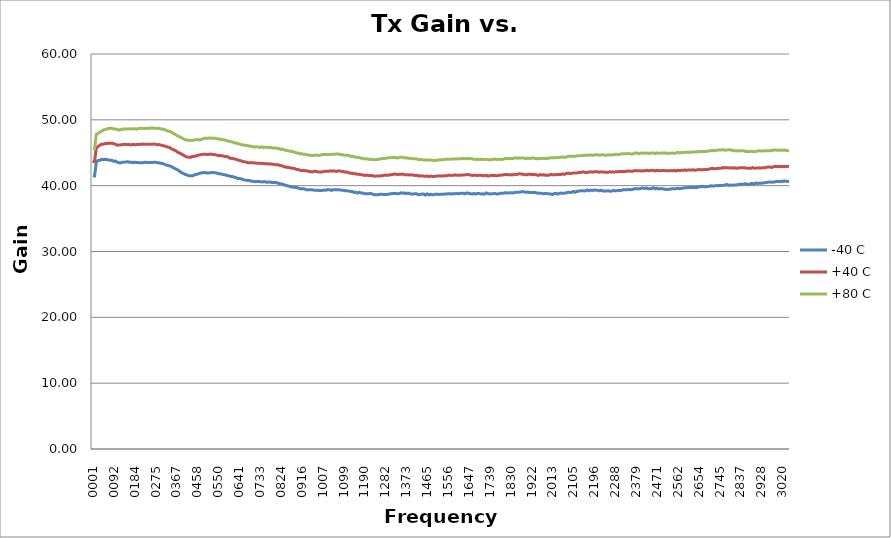
| Category | -40 C | +40 C | +80 C |
|---|---|---|---|
| 1000000.0 | 41.5 | 43.5 | 45.6 |
| 8622500.0 | 41.471 | 43.766 | 45.624 |
| 16245000.0 | 43.64 | 45.762 | 47.831 |
| 23867500.0 | 43.83 | 45.94 | 47.944 |
| 31490000.0 | 43.849 | 46.145 | 48.134 |
| 39112500.0 | 43.963 | 46.312 | 48.281 |
| 46735000.0 | 43.979 | 46.297 | 48.433 |
| 54357500.0 | 43.97 | 46.402 | 48.523 |
| 61980000.0 | 43.991 | 46.395 | 48.594 |
| 69602500.0 | 43.896 | 46.462 | 48.706 |
| 77225000.0 | 43.856 | 46.426 | 48.693 |
| 84847500.0 | 43.843 | 46.466 | 48.718 |
| 92470000.0 | 43.697 | 46.364 | 48.589 |
| 100092500.0 | 43.739 | 46.298 | 48.614 |
| 107715000.0 | 43.565 | 46.153 | 48.523 |
| 115337500.0 | 43.472 | 46.164 | 48.444 |
| 122960000.0 | 43.462 | 46.197 | 48.558 |
| 130582500.0 | 43.574 | 46.237 | 48.528 |
| 138205000.0 | 43.575 | 46.28 | 48.633 |
| 145827500.0 | 43.583 | 46.267 | 48.602 |
| 153450000.0 | 43.626 | 46.243 | 48.606 |
| 161072500.0 | 43.569 | 46.236 | 48.64 |
| 168695000.0 | 43.57 | 46.18 | 48.613 |
| 176317500.0 | 43.497 | 46.273 | 48.64 |
| 183940000.0 | 43.576 | 46.2 | 48.644 |
| 191562500.0 | 43.511 | 46.27 | 48.581 |
| 199185000.0 | 43.501 | 46.245 | 48.676 |
| 206807500.0 | 43.494 | 46.288 | 48.689 |
| 214430000.0 | 43.501 | 46.257 | 48.731 |
| 222052500.0 | 43.482 | 46.337 | 48.695 |
| 229675000.0 | 43.562 | 46.28 | 48.687 |
| 237297500.0 | 43.526 | 46.294 | 48.728 |
| 244920000.0 | 43.492 | 46.285 | 48.654 |
| 252542500.0 | 43.545 | 46.284 | 48.779 |
| 260165000.0 | 43.504 | 46.285 | 48.709 |
| 267787500.0 | 43.555 | 46.321 | 48.765 |
| 275410000.0 | 43.549 | 46.296 | 48.688 |
| 283032500.0 | 43.471 | 46.212 | 48.666 |
| 290655000.0 | 43.47 | 46.248 | 48.734 |
| 298277500.0 | 43.406 | 46.165 | 48.64 |
| 305900000.0 | 43.364 | 46.096 | 48.584 |
| 313522500.0 | 43.273 | 46.036 | 48.521 |
| 321145000.0 | 43.145 | 45.967 | 48.428 |
| 328767500.0 | 43.081 | 45.844 | 48.292 |
| 336390000.0 | 43.006 | 45.809 | 48.259 |
| 344012500.0 | 42.924 | 45.603 | 48.128 |
| 351635000.0 | 42.74 | 45.505 | 47.982 |
| 359257500.0 | 42.625 | 45.389 | 47.829 |
| 366880000.0 | 42.5 | 45.231 | 47.679 |
| 374502500.0 | 42.358 | 45.032 | 47.499 |
| 382125000.0 | 42.14 | 44.949 | 47.419 |
| 389747500.0 | 41.966 | 44.775 | 47.255 |
| 397370000.0 | 41.877 | 44.642 | 47.136 |
| 404992500.0 | 41.702 | 44.468 | 46.964 |
| 412615000.0 | 41.632 | 44.348 | 46.944 |
| 420237500.0 | 41.519 | 44.332 | 46.892 |
| 427860000.0 | 41.508 | 44.294 | 46.879 |
| 435482500.0 | 41.491 | 44.434 | 46.867 |
| 443105000.0 | 41.577 | 44.447 | 46.928 |
| 450727500.0 | 41.712 | 44.458 | 46.995 |
| 458350000.0 | 41.735 | 44.598 | 46.981 |
| 465972500.0 | 41.867 | 44.654 | 46.971 |
| 473595000.0 | 41.913 | 44.698 | 46.99 |
| 481217500.0 | 41.958 | 44.748 | 47.087 |
| 488840000.0 | 42.007 | 44.789 | 47.21 |
| 496462500.0 | 41.973 | 44.765 | 47.186 |
| 504085000.0 | 41.899 | 44.717 | 47.215 |
| 511707500.0 | 41.951 | 44.793 | 47.227 |
| 519330000.0 | 41.989 | 44.764 | 47.232 |
| 526952500.0 | 41.988 | 44.745 | 47.187 |
| 534575000.0 | 41.965 | 44.716 | 47.215 |
| 542197500.0 | 41.931 | 44.661 | 47.152 |
| 549820000.0 | 41.827 | 44.557 | 47.073 |
| 557442500.0 | 41.801 | 44.59 | 47.07 |
| 565065000.0 | 41.754 | 44.542 | 46.974 |
| 572687500.0 | 41.681 | 44.496 | 46.978 |
| 580310000.0 | 41.643 | 44.421 | 46.904 |
| 587932500.0 | 41.554 | 44.414 | 46.82 |
| 595555000.0 | 41.512 | 44.307 | 46.77 |
| 603177500.0 | 41.393 | 44.143 | 46.688 |
| 610800000.0 | 41.411 | 44.148 | 46.662 |
| 618422500.0 | 41.289 | 44.064 | 46.528 |
| 626045000.0 | 41.264 | 44.041 | 46.52 |
| 633667500.0 | 41.096 | 43.923 | 46.386 |
| 641290000.0 | 41.073 | 43.855 | 46.344 |
| 648912500.0 | 41.065 | 43.787 | 46.264 |
| 656535000.0 | 40.949 | 43.675 | 46.178 |
| 664157500.0 | 40.884 | 43.626 | 46.176 |
| 671780000.0 | 40.817 | 43.588 | 46.075 |
| 679402500.0 | 40.798 | 43.482 | 46.096 |
| 687025000.0 | 40.787 | 43.462 | 46.007 |
| 694647500.0 | 40.667 | 43.481 | 45.992 |
| 702270000.0 | 40.684 | 43.479 | 45.901 |
| 709892500.0 | 40.608 | 43.445 | 45.882 |
| 717515000.0 | 40.624 | 43.408 | 45.902 |
| 725137500.0 | 40.632 | 43.424 | 45.879 |
| 732760000.0 | 40.606 | 43.381 | 45.791 |
| 740382500.0 | 40.568 | 43.39 | 45.903 |
| 748005000.0 | 40.584 | 43.359 | 45.804 |
| 755627500.0 | 40.608 | 43.338 | 45.825 |
| 763250000.0 | 40.514 | 43.321 | 45.852 |
| 770872500.0 | 40.55 | 43.302 | 45.769 |
| 778495000.0 | 40.563 | 43.315 | 45.808 |
| 786117500.0 | 40.462 | 43.25 | 45.713 |
| 793740000.0 | 40.493 | 43.246 | 45.71 |
| 801362500.0 | 40.504 | 43.178 | 45.738 |
| 808985000.0 | 40.38 | 43.198 | 45.678 |
| 816607500.0 | 40.353 | 43.115 | 45.62 |
| 824230000.0 | 40.246 | 43.054 | 45.496 |
| 831852500.0 | 40.244 | 42.996 | 45.558 |
| 839475000.0 | 40.098 | 42.854 | 45.409 |
| 847097500.0 | 40.055 | 42.84 | 45.349 |
| 854720000.0 | 39.947 | 42.734 | 45.326 |
| 862342500.0 | 39.908 | 42.754 | 45.242 |
| 869965000.0 | 39.804 | 42.659 | 45.19 |
| 877587500.0 | 39.79 | 42.642 | 45.159 |
| 885210000.0 | 39.732 | 42.589 | 45.068 |
| 892832500.0 | 39.722 | 42.474 | 44.962 |
| 900455000.0 | 39.631 | 42.443 | 44.952 |
| 908077500.0 | 39.546 | 42.34 | 44.822 |
| 915700000.0 | 39.508 | 42.273 | 44.855 |
| 923322500.0 | 39.546 | 42.326 | 44.754 |
| 930945000.0 | 39.437 | 42.256 | 44.754 |
| 938567500.0 | 39.356 | 42.261 | 44.691 |
| 946190000.0 | 39.391 | 42.159 | 44.638 |
| 953812500.0 | 39.389 | 42.152 | 44.616 |
| 961435000.0 | 39.37 | 42.071 | 44.569 |
| 969057500.0 | 39.322 | 42.186 | 44.615 |
| 976680000.0 | 39.298 | 42.168 | 44.607 |
| 984302500.0 | 39.311 | 42.099 | 44.625 |
| 991925000.0 | 39.273 | 42.088 | 44.596 |
| 999547500.0 | 39.258 | 42.056 | 44.675 |
| 1007170000.0 | 39.311 | 42.096 | 44.721 |
| 1014792500.0 | 39.331 | 42.195 | 44.74 |
| 1022415000.0 | 39.314 | 42.193 | 44.708 |
| 1030037500.0 | 39.406 | 42.189 | 44.749 |
| 1037660000.0 | 39.377 | 42.218 | 44.739 |
| 1045282500.0 | 39.277 | 42.206 | 44.767 |
| 1052905000.0 | 39.378 | 42.256 | 44.782 |
| 1060527500.0 | 39.392 | 42.208 | 44.768 |
| 1068150000.0 | 39.364 | 42.164 | 44.812 |
| 1075772500.0 | 39.386 | 42.242 | 44.793 |
| 1083395000.0 | 39.357 | 42.238 | 44.733 |
| 1091017500.0 | 39.3 | 42.155 | 44.721 |
| 1098640000.0 | 39.305 | 42.141 | 44.648 |
| 1106262500.0 | 39.214 | 42.042 | 44.627 |
| 1113885000.0 | 39.227 | 42.085 | 44.629 |
| 1121507500.0 | 39.184 | 41.952 | 44.592 |
| 1129130000.0 | 39.132 | 41.904 | 44.447 |
| 1136752500.0 | 39.132 | 41.896 | 44.486 |
| 1144375000.0 | 38.971 | 41.818 | 44.374 |
| 1151997500.0 | 39.017 | 41.803 | 44.331 |
| 1159620000.0 | 38.887 | 41.717 | 44.299 |
| 1167242500.0 | 39.001 | 41.717 | 44.29 |
| 1174865000.0 | 38.873 | 41.667 | 44.158 |
| 1182487500.0 | 38.891 | 41.662 | 44.162 |
| 1190110000.0 | 38.76 | 41.538 | 44.051 |
| 1197732500.0 | 38.799 | 41.61 | 44.099 |
| 1205355000.0 | 38.754 | 41.575 | 44.045 |
| 1212977500.0 | 38.803 | 41.505 | 43.983 |
| 1220600000.0 | 38.786 | 41.568 | 43.99 |
| 1228222500.0 | 38.686 | 41.494 | 43.976 |
| 1235845000.0 | 38.615 | 41.439 | 43.923 |
| 1243467500.0 | 38.623 | 41.46 | 43.971 |
| 1251090000.0 | 38.634 | 41.466 | 43.995 |
| 1258712500.0 | 38.697 | 41.482 | 44.053 |
| 1266335000.0 | 38.687 | 41.516 | 44.088 |
| 1273957500.0 | 38.66 | 41.538 | 44.147 |
| 1281580000.0 | 38.663 | 41.61 | 44.138 |
| 1289202500.0 | 38.656 | 41.589 | 44.208 |
| 1296825000.0 | 38.714 | 41.599 | 44.227 |
| 1304447500.0 | 38.778 | 41.675 | 44.231 |
| 1312070000.0 | 38.799 | 41.646 | 44.273 |
| 1319692500.0 | 38.808 | 41.772 | 44.319 |
| 1327315000.0 | 38.841 | 41.741 | 44.251 |
| 1334937500.0 | 38.765 | 41.705 | 44.212 |
| 1342560000.0 | 38.801 | 41.716 | 44.285 |
| 1350182500.0 | 38.911 | 41.739 | 44.308 |
| 1357805000.0 | 38.862 | 41.761 | 44.305 |
| 1365427500.0 | 38.889 | 41.662 | 44.217 |
| 1373050000.0 | 38.794 | 41.665 | 44.25 |
| 1380672500.0 | 38.872 | 41.674 | 44.147 |
| 1388295000.0 | 38.778 | 41.61 | 44.156 |
| 1395917500.0 | 38.73 | 41.648 | 44.111 |
| 1403540000.0 | 38.745 | 41.62 | 44.098 |
| 1411162500.0 | 38.767 | 41.549 | 44.099 |
| 1418785000.0 | 38.758 | 41.586 | 44.075 |
| 1426407500.0 | 38.619 | 41.493 | 43.958 |
| 1434030000.0 | 38.657 | 41.478 | 43.986 |
| 1441652500.0 | 38.727 | 41.493 | 43.947 |
| 1449275000.0 | 38.716 | 41.451 | 43.906 |
| 1456897500.0 | 38.574 | 41.425 | 43.876 |
| 1464520000.0 | 38.761 | 41.471 | 43.933 |
| 1472142500.0 | 38.594 | 41.369 | 43.852 |
| 1479765000.0 | 38.694 | 41.47 | 43.9 |
| 1487387500.0 | 38.63 | 41.403 | 43.862 |
| 1495010000.0 | 38.634 | 41.399 | 43.837 |
| 1502632500.0 | 38.722 | 41.426 | 43.833 |
| 1510255000.0 | 38.695 | 41.489 | 43.907 |
| 1517877500.0 | 38.658 | 41.467 | 43.913 |
| 1525500000.0 | 38.712 | 41.47 | 43.933 |
| 1533122500.0 | 38.688 | 41.469 | 43.913 |
| 1540745000.0 | 38.733 | 41.513 | 43.986 |
| 1548367500.0 | 38.726 | 41.484 | 44.022 |
| 1555990000.0 | 38.765 | 41.565 | 44.034 |
| 1563612500.0 | 38.789 | 41.586 | 44.014 |
| 1571235000.0 | 38.721 | 41.562 | 44.037 |
| 1578857500.0 | 38.792 | 41.564 | 44.031 |
| 1586480000.0 | 38.767 | 41.639 | 44.062 |
| 1594102500.0 | 38.824 | 41.571 | 44.093 |
| 1601725000.0 | 38.77 | 41.607 | 44.058 |
| 1609347500.0 | 38.836 | 41.578 | 44.089 |
| 1616970000.0 | 38.856 | 41.622 | 44.089 |
| 1624592500.0 | 38.819 | 41.633 | 44.148 |
| 1632215000.0 | 38.76 | 41.646 | 44.079 |
| 1639837500.0 | 38.901 | 41.684 | 44.119 |
| 1647460000.0 | 38.836 | 41.668 | 44.113 |
| 1655082500.0 | 38.77 | 41.619 | 44.081 |
| 1662705000.0 | 38.725 | 41.529 | 44.075 |
| 1670327500.0 | 38.818 | 41.61 | 44.008 |
| 1677950000.0 | 38.723 | 41.555 | 43.964 |
| 1685572500.0 | 38.821 | 41.554 | 44.031 |
| 1693195000.0 | 38.81 | 41.573 | 43.97 |
| 1700817500.0 | 38.731 | 41.575 | 44.024 |
| 1708440000.0 | 38.758 | 41.53 | 43.985 |
| 1716062500.0 | 38.713 | 41.512 | 43.98 |
| 1723685000.0 | 38.899 | 41.592 | 44.001 |
| 1731307500.0 | 38.799 | 41.452 | 43.965 |
| 1738930000.0 | 38.727 | 41.509 | 43.916 |
| 1746552500.0 | 38.777 | 41.58 | 43.95 |
| 1754175000.0 | 38.772 | 41.53 | 44.007 |
| 1761797500.0 | 38.824 | 41.555 | 44.033 |
| 1769420000.0 | 38.724 | 41.5 | 43.974 |
| 1777042500.0 | 38.755 | 41.566 | 44.021 |
| 1784665000.0 | 38.838 | 41.58 | 43.982 |
| 1792287500.0 | 38.834 | 41.609 | 43.995 |
| 1799910000.0 | 38.843 | 41.652 | 44.036 |
| 1807532500.0 | 38.946 | 41.687 | 44.111 |
| 1815155000.0 | 38.879 | 41.679 | 44.145 |
| 1822777500.0 | 38.897 | 41.664 | 44.089 |
| 1830400000.0 | 38.926 | 41.654 | 44.126 |
| 1838022500.0 | 38.897 | 41.628 | 44.112 |
| 1845645000.0 | 38.944 | 41.739 | 44.163 |
| 1853267500.0 | 38.99 | 41.701 | 44.232 |
| 1860890000.0 | 38.996 | 41.722 | 44.172 |
| 1868512500.0 | 39.019 | 41.814 | 44.217 |
| 1876135000.0 | 39.019 | 41.771 | 44.197 |
| 1883757500.0 | 39.101 | 41.742 | 44.22 |
| 1891380000.0 | 39.032 | 41.674 | 44.177 |
| 1899002500.0 | 38.991 | 41.646 | 44.079 |
| 1906625000.0 | 39.026 | 41.713 | 44.198 |
| 1914247500.0 | 38.955 | 41.741 | 44.101 |
| 1921870000.0 | 38.958 | 41.67 | 44.204 |
| 1929492500.0 | 38.961 | 41.727 | 44.21 |
| 1937115000.0 | 38.978 | 41.678 | 44.126 |
| 1944737500.0 | 38.891 | 41.64 | 44.072 |
| 1952360000.0 | 38.861 | 41.557 | 44.139 |
| 1959982500.0 | 38.859 | 41.687 | 44.118 |
| 1967605000.0 | 38.828 | 41.613 | 44.104 |
| 1975227500.0 | 38.761 | 41.654 | 44.161 |
| 1982850000.0 | 38.831 | 41.573 | 44.12 |
| 1990472500.0 | 38.787 | 41.6 | 44.113 |
| 1998095000.0 | 38.764 | 41.601 | 44.206 |
| 2005717500.0 | 38.734 | 41.71 | 44.228 |
| 2013340000.0 | 38.662 | 41.645 | 44.257 |
| 2020962500.0 | 38.792 | 41.649 | 44.252 |
| 2028585000.0 | 38.833 | 41.688 | 44.241 |
| 2036207500.0 | 38.714 | 41.701 | 44.277 |
| 2043830000.0 | 38.846 | 41.714 | 44.263 |
| 2051452500.0 | 38.876 | 41.707 | 44.344 |
| 2059075000.0 | 38.829 | 41.797 | 44.362 |
| 2066697500.0 | 38.878 | 41.724 | 44.294 |
| 2074320000.0 | 38.882 | 41.848 | 44.344 |
| 2081942500.0 | 39.021 | 41.908 | 44.468 |
| 2089565000.0 | 38.963 | 41.857 | 44.478 |
| 2097187500.0 | 38.993 | 41.864 | 44.481 |
| 2104810000.0 | 39.134 | 41.927 | 44.486 |
| 2112432500.0 | 38.984 | 41.928 | 44.431 |
| 2120055000.0 | 39.135 | 41.91 | 44.535 |
| 2127677500.0 | 39.142 | 41.99 | 44.561 |
| 2135300000.0 | 39.216 | 42.013 | 44.545 |
| 2142922500.0 | 39.243 | 42.055 | 44.574 |
| 2150545000.0 | 39.199 | 42.1 | 44.592 |
| 2158167500.0 | 39.21 | 41.988 | 44.607 |
| 2165790000.0 | 39.349 | 42.016 | 44.661 |
| 2173412500.0 | 39.214 | 42.067 | 44.606 |
| 2181035000.0 | 39.335 | 42.107 | 44.678 |
| 2188657500.0 | 39.27 | 42.046 | 44.596 |
| 2196280000.0 | 39.346 | 42.124 | 44.662 |
| 2203902500.0 | 39.297 | 42.126 | 44.719 |
| 2211525000.0 | 39.297 | 42.086 | 44.665 |
| 2219147500.0 | 39.216 | 42.052 | 44.644 |
| 2226770000.0 | 39.317 | 42.099 | 44.676 |
| 2234392500.0 | 39.176 | 42.073 | 44.686 |
| 2242015000.0 | 39.18 | 42.041 | 44.636 |
| 2249637500.0 | 39.177 | 42.052 | 44.618 |
| 2257260000.0 | 39.234 | 42.031 | 44.681 |
| 2264882500.0 | 39.157 | 42.106 | 44.666 |
| 2272505000.0 | 39.173 | 42.055 | 44.688 |
| 2280127500.0 | 39.263 | 42.064 | 44.655 |
| 2287750000.0 | 39.229 | 42.1 | 44.739 |
| 2295372500.0 | 39.24 | 42.097 | 44.777 |
| 2302995000.0 | 39.303 | 42.117 | 44.725 |
| 2310617500.0 | 39.253 | 42.176 | 44.786 |
| 2318240000.0 | 39.323 | 42.15 | 44.839 |
| 2325862500.0 | 39.394 | 42.128 | 44.851 |
| 2333485000.0 | 39.362 | 42.164 | 44.839 |
| 2341107500.0 | 39.395 | 42.197 | 44.86 |
| 2348730000.0 | 39.421 | 42.226 | 44.884 |
| 2356352500.0 | 39.375 | 42.191 | 44.794 |
| 2363975000.0 | 39.433 | 42.191 | 44.807 |
| 2371597500.0 | 39.515 | 42.253 | 44.928 |
| 2379220000.0 | 39.515 | 42.3 | 44.956 |
| 2386842500.0 | 39.547 | 42.25 | 44.937 |
| 2394465000.0 | 39.513 | 42.257 | 44.85 |
| 2402087500.0 | 39.619 | 42.238 | 44.96 |
| 2409710000.0 | 39.636 | 42.27 | 44.935 |
| 2417332500.0 | 39.572 | 42.232 | 44.937 |
| 2424955000.0 | 39.639 | 42.34 | 44.968 |
| 2432577500.0 | 39.52 | 42.287 | 44.908 |
| 2440200000.0 | 39.544 | 42.278 | 44.919 |
| 2447822500.0 | 39.547 | 42.347 | 44.949 |
| 2455445000.0 | 39.68 | 42.317 | 44.982 |
| 2463067500.0 | 39.515 | 42.226 | 44.871 |
| 2470690000.0 | 39.592 | 42.338 | 44.992 |
| 2478312500.0 | 39.511 | 42.283 | 44.909 |
| 2485935000.0 | 39.537 | 42.274 | 44.922 |
| 2493557500.0 | 39.549 | 42.315 | 44.977 |
| 2501180000.0 | 39.49 | 42.308 | 44.943 |
| 2508802500.0 | 39.444 | 42.253 | 44.967 |
| 2516425000.0 | 39.421 | 42.264 | 44.897 |
| 2524047500.0 | 39.454 | 42.26 | 44.929 |
| 2531670000.0 | 39.488 | 42.306 | 44.931 |
| 2539292500.0 | 39.546 | 42.251 | 44.957 |
| 2546915000.0 | 39.53 | 42.322 | 44.911 |
| 2554537500.0 | 39.532 | 42.225 | 44.946 |
| 2562160000.0 | 39.611 | 42.337 | 45.074 |
| 2569782500.0 | 39.522 | 42.282 | 44.97 |
| 2577405000.0 | 39.578 | 42.331 | 45.059 |
| 2585027500.0 | 39.623 | 42.325 | 45.004 |
| 2592650000.0 | 39.688 | 42.383 | 45.056 |
| 2600272500.0 | 39.688 | 42.317 | 45.074 |
| 2607895000.0 | 39.709 | 42.395 | 45.095 |
| 2615517500.0 | 39.724 | 42.389 | 45.055 |
| 2623140000.0 | 39.699 | 42.359 | 45.091 |
| 2630762500.0 | 39.759 | 42.41 | 45.125 |
| 2638385000.0 | 39.693 | 42.34 | 45.13 |
| 2646007500.0 | 39.725 | 42.386 | 45.126 |
| 2653630000.0 | 39.81 | 42.461 | 45.218 |
| 2661252500.0 | 39.826 | 42.404 | 45.156 |
| 2668875000.0 | 39.915 | 42.444 | 45.201 |
| 2676497500.0 | 39.849 | 42.416 | 45.205 |
| 2684120000.0 | 39.819 | 42.477 | 45.203 |
| 2691742500.0 | 39.876 | 42.44 | 45.228 |
| 2699365000.0 | 39.89 | 42.529 | 45.262 |
| 2706987500.0 | 39.986 | 42.603 | 45.328 |
| 2714610000.0 | 39.93 | 42.632 | 45.353 |
| 2722232500.0 | 39.961 | 42.553 | 45.297 |
| 2729855000.0 | 40.008 | 42.592 | 45.367 |
| 2737477500.0 | 40.005 | 42.624 | 45.395 |
| 2745100000.0 | 40.024 | 42.663 | 45.419 |
| 2752722500.0 | 40.003 | 42.654 | 45.42 |
| 2760345000.0 | 40.036 | 42.763 | 45.45 |
| 2767967500.0 | 40.069 | 42.686 | 45.382 |
| 2775590000.0 | 40.192 | 42.753 | 45.428 |
| 2783212500.0 | 40.03 | 42.691 | 45.432 |
| 2790835000.0 | 40.102 | 42.719 | 45.457 |
| 2798457500.0 | 40.062 | 42.683 | 45.394 |
| 2806080000.0 | 40.083 | 42.682 | 45.319 |
| 2813702500.0 | 40.116 | 42.71 | 45.319 |
| 2821325000.0 | 40.113 | 42.63 | 45.274 |
| 2828947500.0 | 40.19 | 42.689 | 45.307 |
| 2836570000.0 | 40.206 | 42.732 | 45.297 |
| 2844192500.0 | 40.196 | 42.713 | 45.291 |
| 2851815000.0 | 40.259 | 42.73 | 45.313 |
| 2859437500.0 | 40.303 | 42.673 | 45.196 |
| 2867060000.0 | 40.181 | 42.664 | 45.193 |
| 2874682500.0 | 40.188 | 42.643 | 45.198 |
| 2882305000.0 | 40.315 | 42.643 | 45.222 |
| 2889927500.0 | 40.318 | 42.751 | 45.198 |
| 2897550000.0 | 40.257 | 42.652 | 45.151 |
| 2905172500.0 | 40.413 | 42.673 | 45.208 |
| 2912795000.0 | 40.335 | 42.685 | 45.272 |
| 2920417500.0 | 40.38 | 42.704 | 45.308 |
| 2928040000.0 | 40.369 | 42.691 | 45.26 |
| 2935662500.0 | 40.418 | 42.718 | 45.263 |
| 2943285000.0 | 40.453 | 42.731 | 45.307 |
| 2950907500.0 | 40.471 | 42.789 | 45.311 |
| 2958530000.0 | 40.534 | 42.837 | 45.305 |
| 2966152500.0 | 40.565 | 42.83 | 45.312 |
| 2973775000.0 | 40.522 | 42.751 | 45.337 |
| 2981397500.0 | 40.545 | 42.89 | 45.402 |
| 2989020000.0 | 40.584 | 42.93 | 45.411 |
| 2996642500.0 | 40.673 | 42.916 | 45.388 |
| 3004265000.0 | 40.602 | 42.881 | 45.39 |
| 3011887500.0 | 40.67 | 42.913 | 45.408 |
| 3019510000.0 | 40.606 | 42.896 | 45.366 |
| 3027132500.0 | 40.715 | 42.94 | 45.411 |
| 3034755000.0 | 40.654 | 42.88 | 45.365 |
| 3042377500.0 | 40.658 | 42.939 | 45.322 |
| 3050000000.0 | 40.628 | 42.914 | 45.305 |